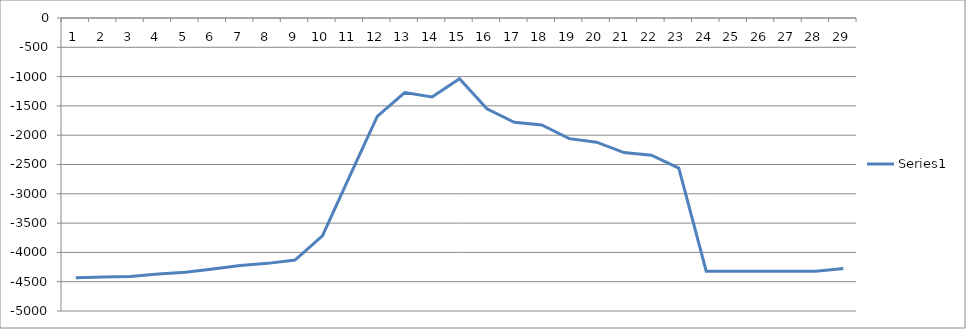
| Category | Series 0 |
|---|---|
| 0 | -4431 |
| 1 | -4418 |
| 2 | -4412.4 |
| 3 | -4369.4 |
| 4 | -4339.5 |
| 5 | -4283.1 |
| 6 | -4225.5 |
| 7 | -4187.2 |
| 8 | -4131.6 |
| 9 | -3719.4 |
| 10 | -2693 |
| 11 | -1677.7 |
| 12 | -1273.6 |
| 13 | -1347.5 |
| 14 | -1036.6 |
| 15 | -1549.1 |
| 16 | -1778.6 |
| 17 | -1825.3 |
| 18 | -2058.7 |
| 19 | -2118.6 |
| 20 | -2296.9 |
| 21 | -2342 |
| 22 | -2561.6 |
| 23 | -4320.8 |
| 24 | -4320.8 |
| 25 | -4320.8 |
| 26 | -4320.8 |
| 27 | -4320.8 |
| 28 | -4275.4 |